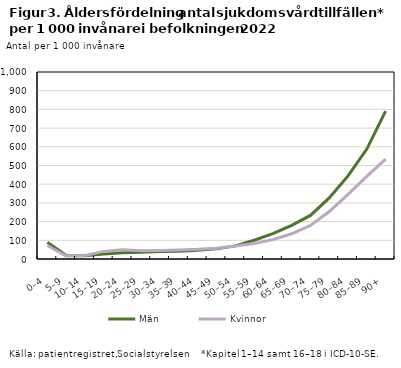
| Category | Män | Kvinnor |
|---|---|---|
| 0–4 | 89.905 | 72.023 |
| 5–9 | 18.814 | 16.223 |
| 10–14 | 17.247 | 19.094 |
| 15–19 | 26.591 | 40.659 |
| 20–24 | 33.955 | 50.071 |
| 25–29 | 35.919 | 43.743 |
| 30–34 | 39.943 | 45.94 |
| 35–39 | 41.696 | 48.498 |
| 40–44 | 46.449 | 51.569 |
| 45–49 | 54.168 | 57.342 |
| 50–54 | 70.074 | 69.121 |
| 55–59 | 100.462 | 82.348 |
| 60–64 | 135.533 | 103.471 |
| 65–69 | 179.675 | 134.731 |
| 70–74 | 233.048 | 179.188 |
| 75–79 | 326.918 | 253.765 |
| 80–84 | 444.582 | 345.38 |
| 85–89 | 587.859 | 441.551 |
| 90+ | 790.55 | 533.962 |